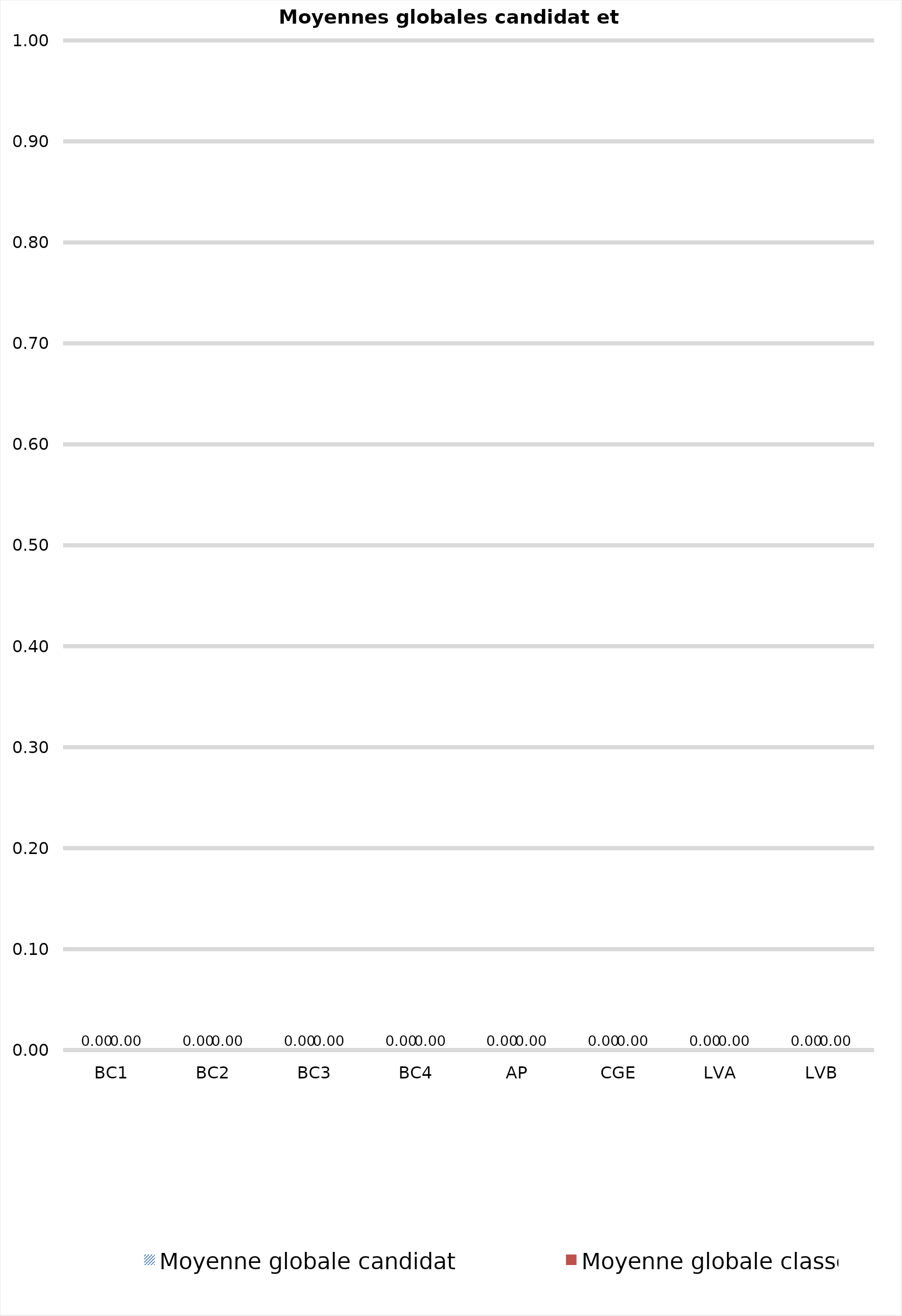
| Category | Moyenne globale candidat | Moyenne globale classe |
|---|---|---|
| 0 | 0 | 0 |
| 1 | 0 | 0 |
| 2 | 0 | 0 |
| 3 | 0 | 0 |
| 4 | 0 | 0 |
| 5 | 0 | 0 |
| 6 | 0 | 0 |
| 7 | 0 | 0 |